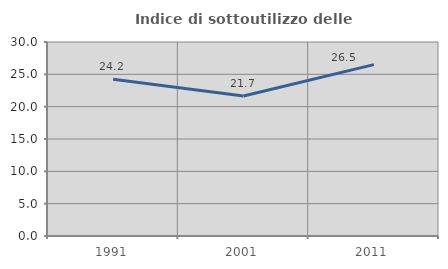
| Category | Indice di sottoutilizzo delle abitazioni  |
|---|---|
| 1991.0 | 24.234 |
| 2001.0 | 21.655 |
| 2011.0 | 26.496 |